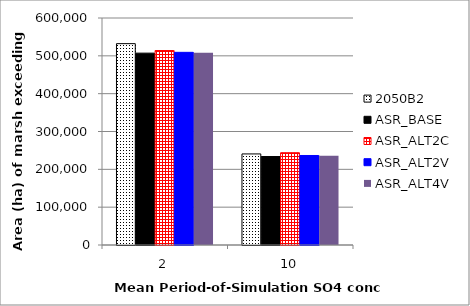
| Category | 2050B2 | ASR_BASE | ASR_ALT2C | ASR_ALT2V | ASR_ALT4V |
|---|---|---|---|---|---|
| 2.0 | 532225 | 507150 | 514025 | 509225 | 508400 |
| 10.0 | 240700 | 233850 | 244000 | 236575 | 235600 |